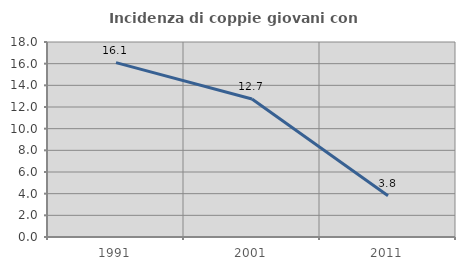
| Category | Incidenza di coppie giovani con figli |
|---|---|
| 1991.0 | 16.092 |
| 2001.0 | 12.745 |
| 2011.0 | 3.804 |